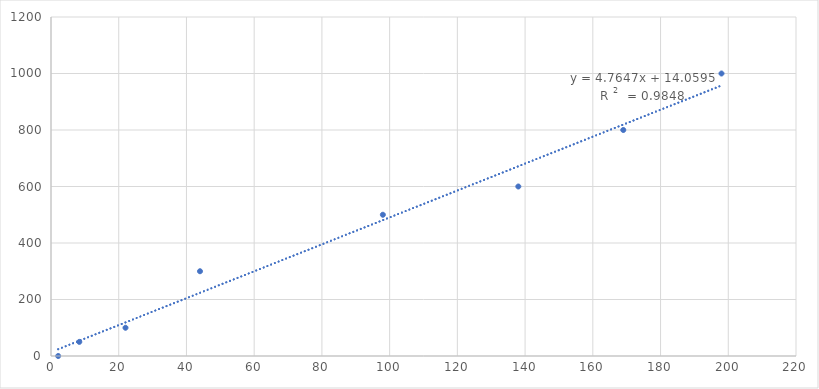
| Category | Concentration (microgram/mL) |
|---|---|
| 2.12 | 0 |
| 22.0 | 100 |
| 44.0 | 300 |
| 98.0 | 500 |
| 169.0 | 800 |
| 198.0 | 1000 |
| 138.0 | 600 |
| 8.36 | 50 |